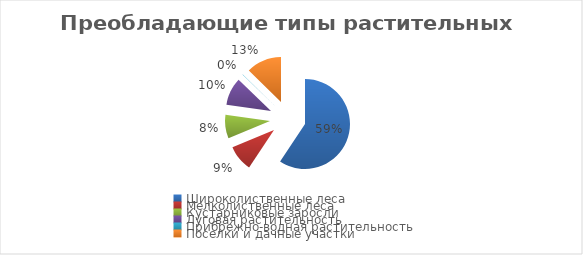
| Category | Series 0 |
|---|---|
| Широколиственные леса | 59.4 |
| Мелколиственные леса | 9.4 |
| Кустарниковые заросли | 8.5 |
| Луговая растительность | 10 |
| Прибрежно-водная растительность | 0.1 |
| Поселки и дачные участки | 12.7 |